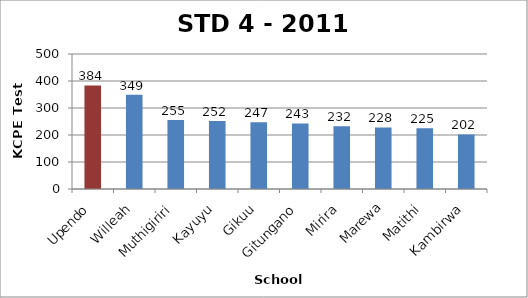
| Category | STD 4 Total Score |
|---|---|
| Upendo | 383.71 |
| Willeah | 349 |
| Muthigiriri | 255.14 |
| Kayuyu | 252.03 |
| Gikuu | 247.38 |
| Gitungano | 242.92 |
| Mirira | 232.09 |
| Marewa | 228.11 |
| Matithi | 225 |
| Kambirwa | 202.14 |